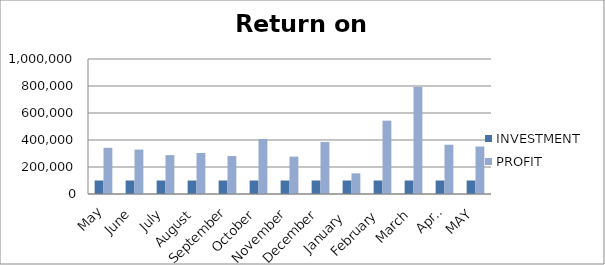
| Category | INVESTMENT  | PROFIT |
|---|---|---|
| May | 100000 | 341995 |
| June | 100000 | 328918 |
| July | 100000 | 288028 |
| August | 100000 | 303853 |
| September | 100000 | 281093 |
| October | 100000 | 407723 |
| November | 100000 | 276937 |
| December | 100000 | 385327 |
| January  | 100000 | 152934 |
| February | 100000 | 543200 |
| March | 100000 | 792720 |
| April | 100000 | 364936 |
| MAY | 100000 | 352040 |